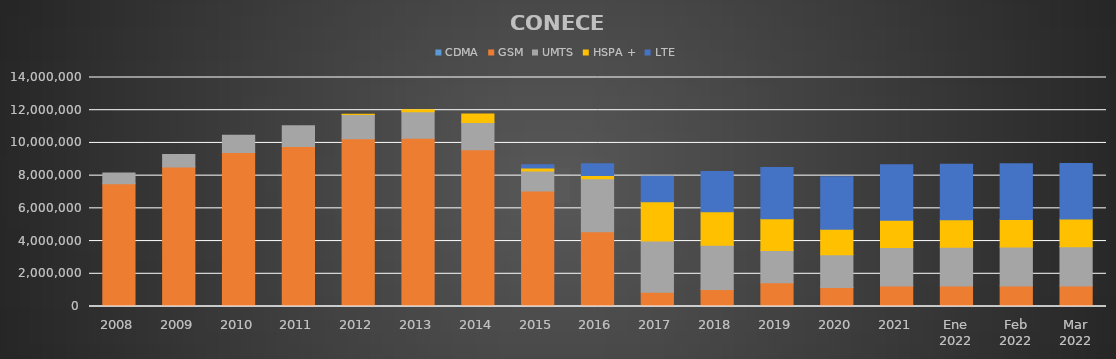
| Category | CDMA | GSM | UMTS | HSPA + | LTE |
|---|---|---|---|---|---|
| 2008 | 0 | 7499370 | 656989 | 0 | 0 |
| 2009 | 0 | 8532691 | 758577 | 0 | 0 |
| 2010 | 0 | 9419193 | 1051309 | 0 | 0 |
| 2011 | 0 | 9774865 | 1282451 | 0 | 0 |
| 2012 | 0 | 10252457 | 1484003 | 21446 | 0 |
| 2013 | 0 | 10287259 | 1622034 | 121593 | 0 |
| 2014 | 0 | 9581956 | 1664758 | 525306 | 0 |
| 2015 | 0 | 7065313 | 1214567 | 183109 | 195630 |
| 2016 | 0 | 4571999 | 3240700 | 201567 | 712557 |
| 2017 | 0 | 873346 | 3135577 | 2399460 | 1551880 |
| 2018 | 0 | 1039373 | 2706058 | 2049418 | 2453201 |
| 2019 | 0 | 1452334 | 1970422 | 1937931 | 3132367 |
| 2020 | 0 | 1158751 | 2009264 | 1548440 | 3212798 |
| 2021 | 0 | 1250925 | 2353798 | 1675346 | 3385646 |
| Ene 2022 | 0 | 1253803 | 2367204 | 1682872 | 3391452 |
| Feb 2022 | 0 | 1256245 | 2379435 | 1688963 | 3397299 |
| Mar 2022 | 0 | 1259631 | 2392596 | 1693034 | 3401696 |